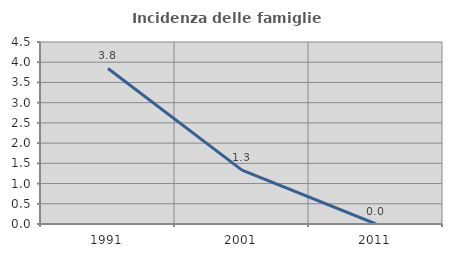
| Category | Incidenza delle famiglie numerose |
|---|---|
| 1991.0 | 3.846 |
| 2001.0 | 1.333 |
| 2011.0 | 0 |